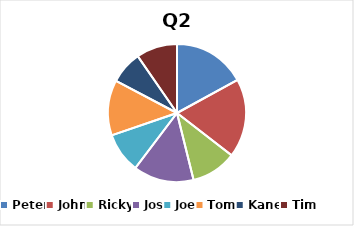
| Category | Q2 Efficiency |
|---|---|
| Peter | 0.876 |
| John | 0.948 |
| Ricky | 0.547 |
| Jos | 0.729 |
| Joe | 0.485 |
| Tom | 0.667 |
| Kane | 0.392 |
| Tim | 0.495 |